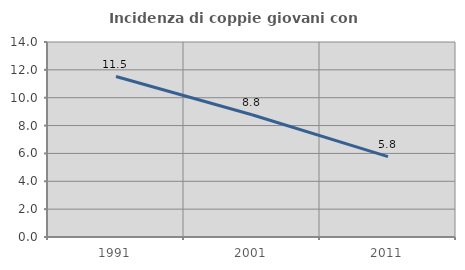
| Category | Incidenza di coppie giovani con figli |
|---|---|
| 1991.0 | 11.52 |
| 2001.0 | 8.775 |
| 2011.0 | 5.772 |